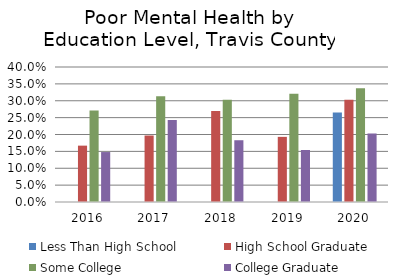
| Category | Less Than High School | High School Graduate | Some College | College Graduate |
|---|---|---|---|---|
| 2016.0 | 0 | 0.167 | 0.271 | 0.148 |
| 2017.0 | 0 | 0.197 | 0.313 | 0.243 |
| 2018.0 | 0 | 0.27 | 0.303 | 0.183 |
| 2019.0 | 0 | 0.193 | 0.321 | 0.154 |
| 2020.0 | 0.265 | 0.303 | 0.337 | 0.203 |